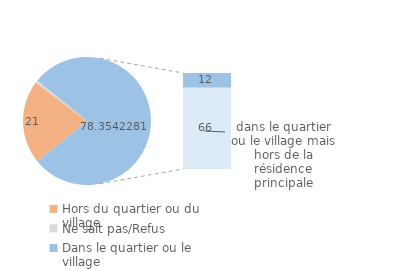
| Category | Series 0 |
|---|---|
| Hors du quartier ou du village | 21.071 |
| Ne sait pas/Refus | 0.575 |
| Dans le quartier ou le village | 12.024 |